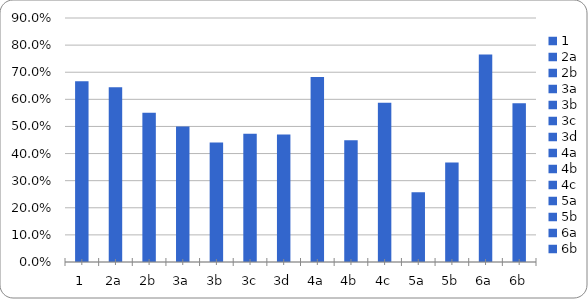
| Category | Series 0 |
|---|---|
| 1 | 0.667 |
| 2a | 0.644 |
| 2b | 0.551 |
| 3a | 0.5 |
| 3b | 0.441 |
| 3c | 0.473 |
| 3d | 0.47 |
| 4a | 0.682 |
| 4b | 0.449 |
| 4c | 0.588 |
| 5a | 0.257 |
| 5b | 0.367 |
| 6a | 0.766 |
| 6b | 0.585 |